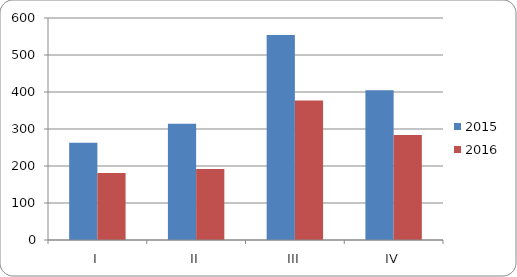
| Category | 2015 | 2016 |
|---|---|---|
| I | 263 | 181 |
| II | 314 | 192 |
| III | 554 | 377 |
| IV | 405 | 284 |